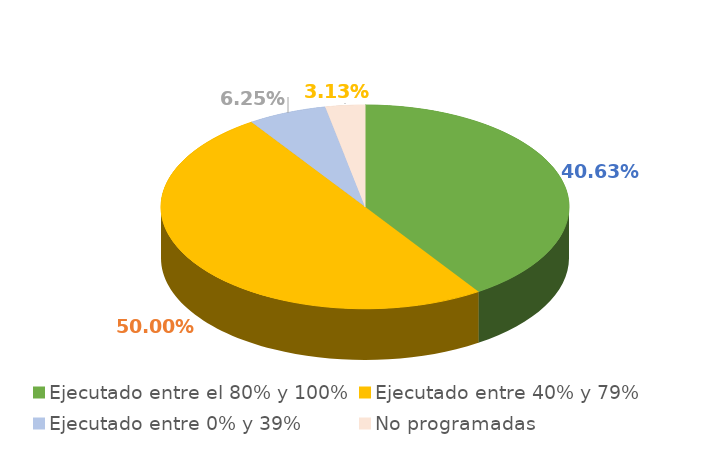
| Category | Series 0 |
|---|---|
| Ejecutado entre el 80% y 100% | 0.406 |
| Ejecutado entre 40% y 79% | 0.5 |
| Ejecutado entre 0% y 39% | 0.062 |
| No programadas | 0.031 |